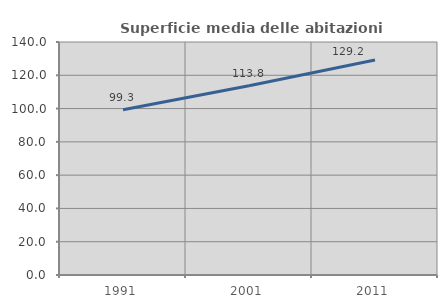
| Category | Superficie media delle abitazioni occupate |
|---|---|
| 1991.0 | 99.299 |
| 2001.0 | 113.764 |
| 2011.0 | 129.213 |